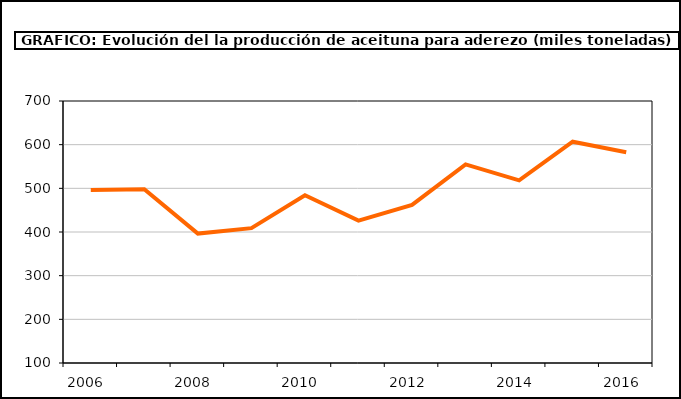
| Category | producción |
|---|---|
| 2006.0 | 495.986 |
| 2007.0 | 497.9 |
| 2008.0 | 396.4 |
| 2009.0 | 408.897 |
| 2010.0 | 484.197 |
| 2011.0 | 425.955 |
| 2012.0 | 461.963 |
| 2013.0 | 554.749 |
| 2014.0 | 518.23 |
| 2015.0 | 606.789 |
| 2016.0 | 582.648 |